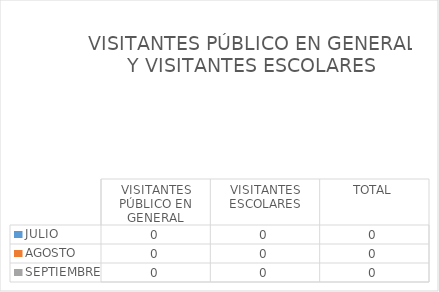
| Category | JULIO | AGOSTO | SEPTIEMBRE |
|---|---|---|---|
| VISITANTES PÚBLICO EN GENERAL | 0 | 0 | 0 |
| VISITANTES ESCOLARES | 0 | 0 | 0 |
| TOTAL | 0 | 0 | 0 |